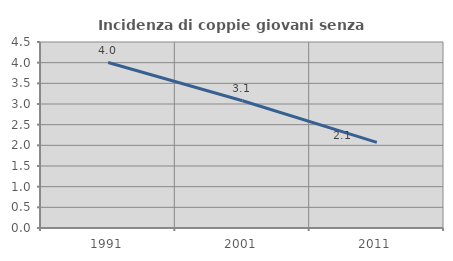
| Category | Incidenza di coppie giovani senza figli |
|---|---|
| 1991.0 | 4.003 |
| 2001.0 | 3.079 |
| 2011.0 | 2.07 |